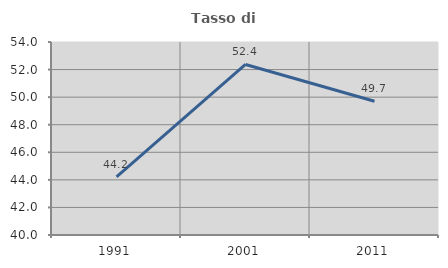
| Category | Tasso di occupazione   |
|---|---|
| 1991.0 | 44.208 |
| 2001.0 | 52.37 |
| 2011.0 | 49.703 |